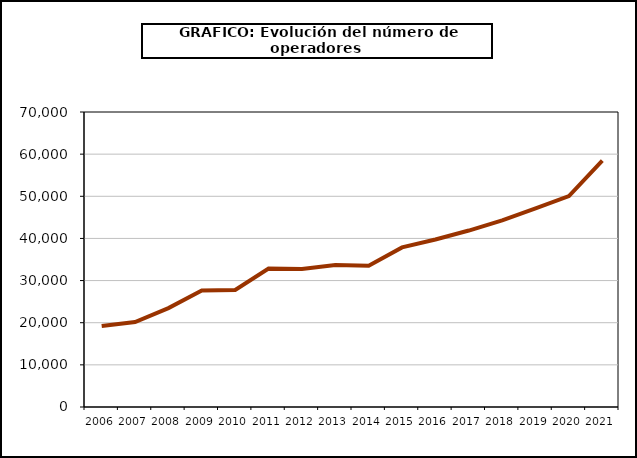
| Category | Operadores (*) |
|---|---|
| 2006.0 | 19211 |
| 2007.0 | 20171 |
| 2008.0 | 23473 |
| 2009.0 | 27627 |
| 2010.0 | 27767 |
| 2011.0 | 32837 |
| 2012.0 | 32724 |
| 2013.0 | 33704 |
| 2014.0 | 33539 |
| 2015.0 | 37870 |
| 2016.0 | 39744 |
| 2017.0 | 41871 |
| 2018.0 | 44282 |
| 2019.0 | 47108 |
| 2020.0 | 50047 |
| 2021.0 | 58485 |